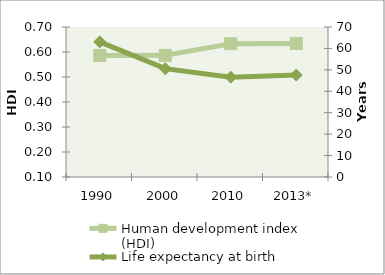
| Category | Human development index (HDI) |
|---|---|
| 1990 | 0.586 |
| 2000 | 0.587 |
| 2010 | 0.633 |
| 2013* | 0.634 |